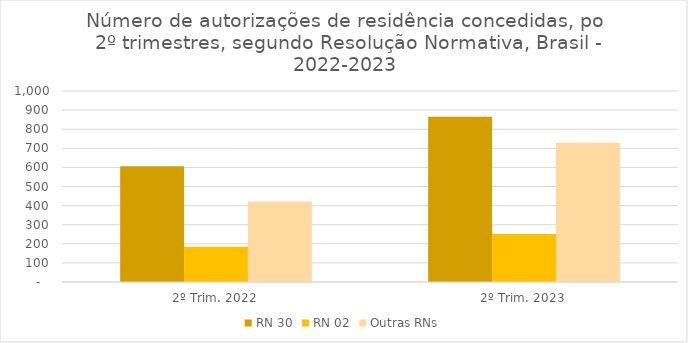
| Category | RN 30 | RN 02 | Outras RNs |
|---|---|---|---|
| 2º Trim. 2022 | 606 | 185 | 422 |
| 2º Trim. 2023 | 865 | 251 | 729 |